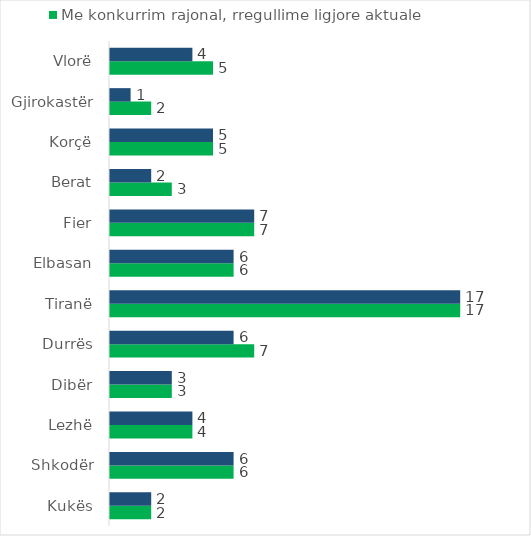
| Category | Me konkurrim rajonal, rregullime ligjore aktuale | Me konkurrim Rajonal, Lista të veçanta për partitë në koalicione |
|---|---|---|
| Kukës | 2 | 2 |
| Shkodër | 6 | 6 |
| Lezhë | 4 | 4 |
| Dibër | 3 | 3 |
| Durrës | 7 | 6 |
| Tiranë | 17 | 17 |
| Elbasan | 6 | 6 |
| Fier | 7 | 7 |
| Berat | 3 | 2 |
| Korçë | 5 | 5 |
| Gjirokastër | 2 | 1 |
| Vlorë | 5 | 4 |